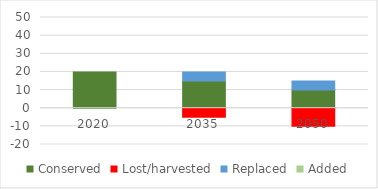
| Category | Conserved | Lost/harvested | Replaced | Added |
|---|---|---|---|---|
| 2020.0 | 20 | 0 | 0 | 0 |
| 2035.0 | 15 | -5 | 5 | 0 |
| 2050.0 | 10 | -10 | 5 | 0 |